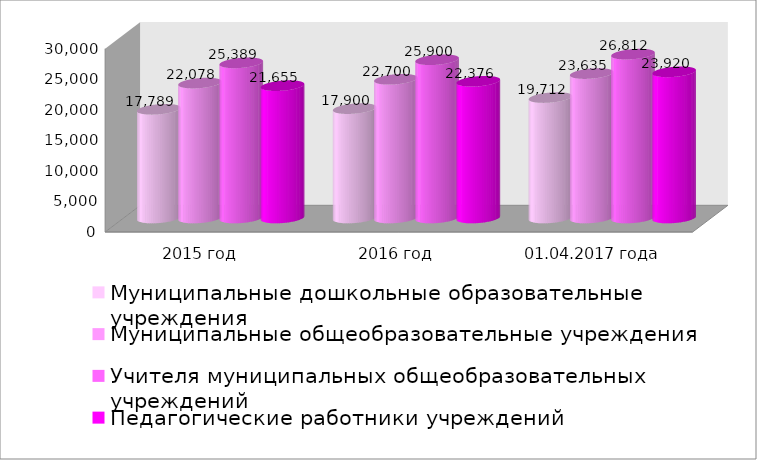
| Category | Муниципальные дошкольные образовательные учреждения | Муниципальные общеобразовательные учреждения | Учителя муниципальных общеобразовательных учреждений | Педагогические работники учреждений дополнительного образования |
|---|---|---|---|---|
| 2015 год | 17789 | 22078 | 25389 | 21655 |
| 2016 год | 17900 | 22700 | 25900 | 22376 |
| 01.04.2017 года | 19712 | 23635 | 26812 | 23920 |